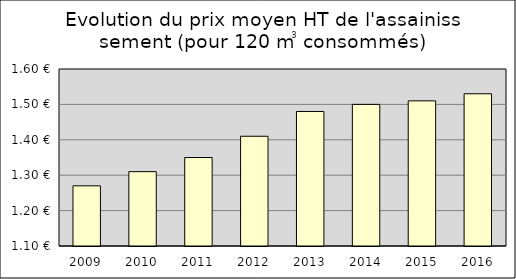
| Category | Series 0 |
|---|---|
| 2009.0 | 1.27 |
| 2010.0 | 1.31 |
| 2011.0 | 1.35 |
| 2012.0 | 1.41 |
| 2013.0 | 1.48 |
| 2014.0 | 1.5 |
| 2015.0 | 1.51 |
| 2016.0 | 1.53 |